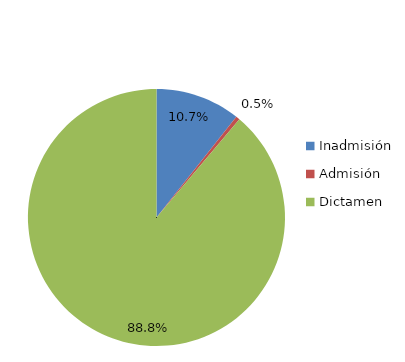
| Category | Series 0 |
|---|---|
| Inadmisión | 503 |
| Admisión | 23 |
| Dictamen | 4188 |